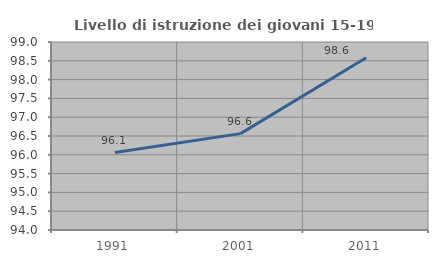
| Category | Livello di istruzione dei giovani 15-19 anni |
|---|---|
| 1991.0 | 96.059 |
| 2001.0 | 96.564 |
| 2011.0 | 98.58 |